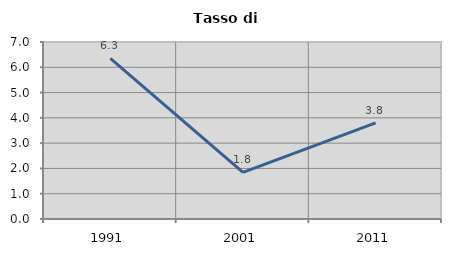
| Category | Tasso di disoccupazione   |
|---|---|
| 1991.0 | 6.349 |
| 2001.0 | 1.843 |
| 2011.0 | 3.803 |